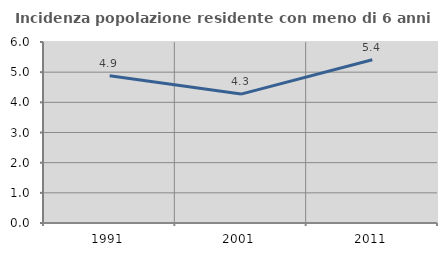
| Category | Incidenza popolazione residente con meno di 6 anni |
|---|---|
| 1991.0 | 4.878 |
| 2001.0 | 4.273 |
| 2011.0 | 5.411 |